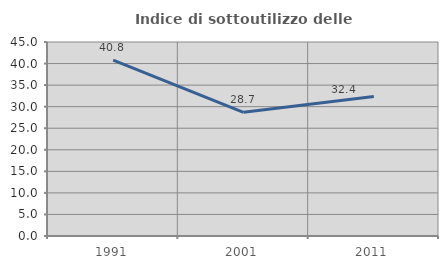
| Category | Indice di sottoutilizzo delle abitazioni  |
|---|---|
| 1991.0 | 40.789 |
| 2001.0 | 28.692 |
| 2011.0 | 32.353 |